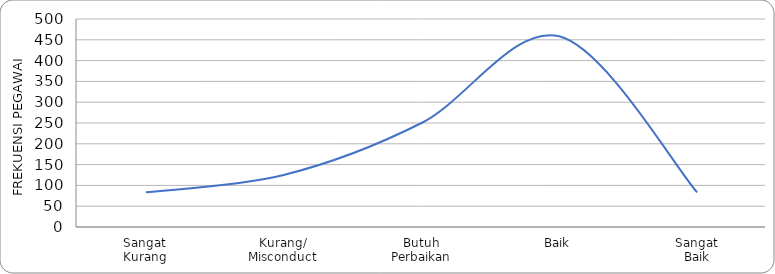
| Category | KURVA DISTRIBUSI
PREDIKAT KINERJA PEGAWAI DENGAN
CAPAIAN KINERJA ORGANISASI ISTIMEWA |
|---|---|
| Sangat
Kurang | 83.333 |
| Kurang/
Misconduct | 125 |
| Butuh
Perbaikan | 250 |
| Baik | 458.333 |
| Sangat
Baik | 83.333 |